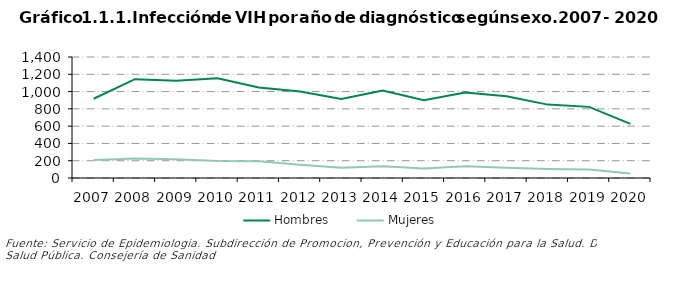
| Category | Hombres | Mujeres |
|---|---|---|
| 0 | 917 | 207 |
| 1 | 1143 | 227 |
| 2 | 1125 | 218 |
| 3 | 1155 | 197 |
| 4 | 1046 | 194 |
| 5 | 1001 | 152 |
| 6 | 914 | 119 |
| 7 | 1011 | 137 |
| 8 | 901 | 110 |
| 9 | 988 | 136 |
| 10 | 946 | 119 |
| 11 | 849 | 105 |
| 12 | 823 | 99 |
| 13 | 626 | 53 |